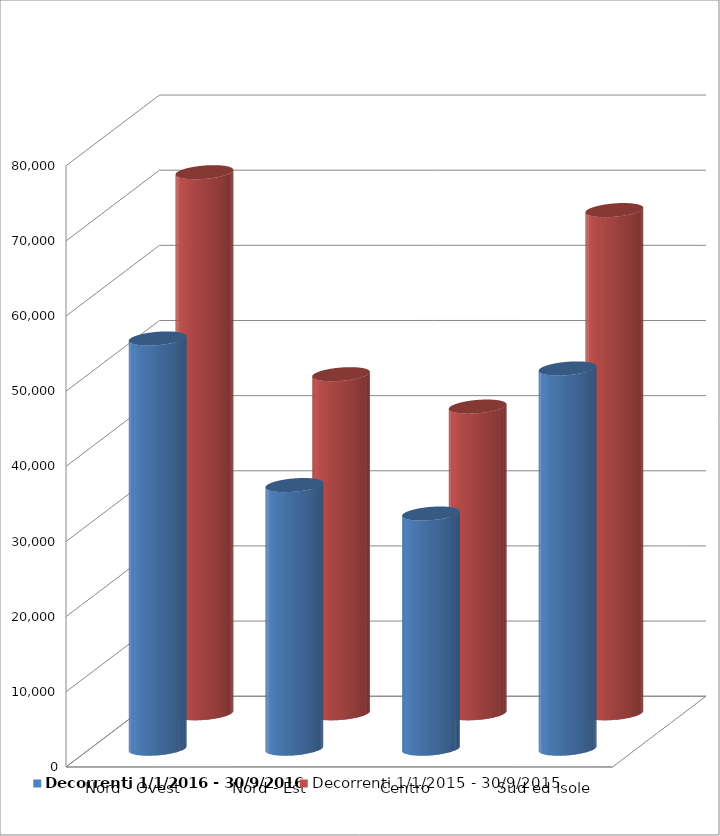
| Category | Decorrenti 1/1/2016 - 30/9/2016 | Decorrenti 1/1/2015 - 30/9/2015 |
|---|---|---|
| Nord - Ovest | 54587 | 72004 |
| Nord - Est | 35080 | 45126 |
| Centro | 31288 | 40817 |
| Sud ed Isole | 50596 | 66962 |